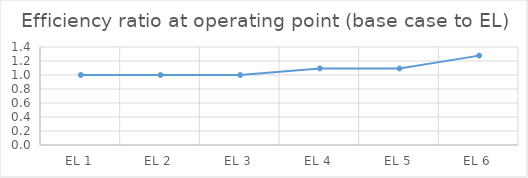
| Category | Efficiency ratio at operating point (base case to EL) |
|---|---|
| EL 1 | 1 |
| EL 2 | 1 |
| EL 3 | 1 |
| EL 4 | 1.093 |
| EL 5 | 1.093 |
| EL 6 | 1.277 |